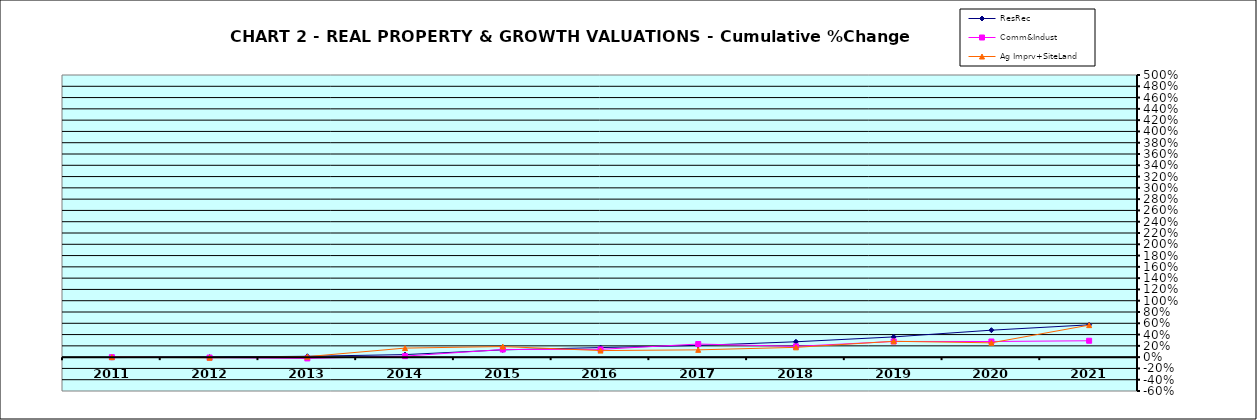
| Category | ResRec | Comm&Indust | Ag Imprv+SiteLand |
|---|---|---|---|
| 2011.0 | -0.008 | 0 | 0 |
| 2012.0 | 0.001 | -0.008 | -0.01 |
| 2013.0 | 0.015 | -0.023 | 0.009 |
| 2014.0 | 0.045 | 0.018 | 0.16 |
| 2015.0 | 0.129 | 0.135 | 0.188 |
| 2016.0 | 0.17 | 0.138 | 0.116 |
| 2017.0 | 0.208 | 0.232 | 0.129 |
| 2018.0 | 0.272 | 0.191 | 0.173 |
| 2019.0 | 0.358 | 0.278 | 0.281 |
| 2020.0 | 0.478 | 0.277 | 0.254 |
| 2021.0 | 0.573 | 0.29 | 0.567 |